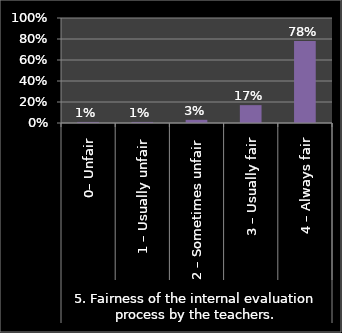
| Category | Series 0 |
|---|---|
| 0 | 0.01 |
| 1 | 0.01 |
| 2 | 0.03 |
| 3 | 0.17 |
| 4 | 0.78 |